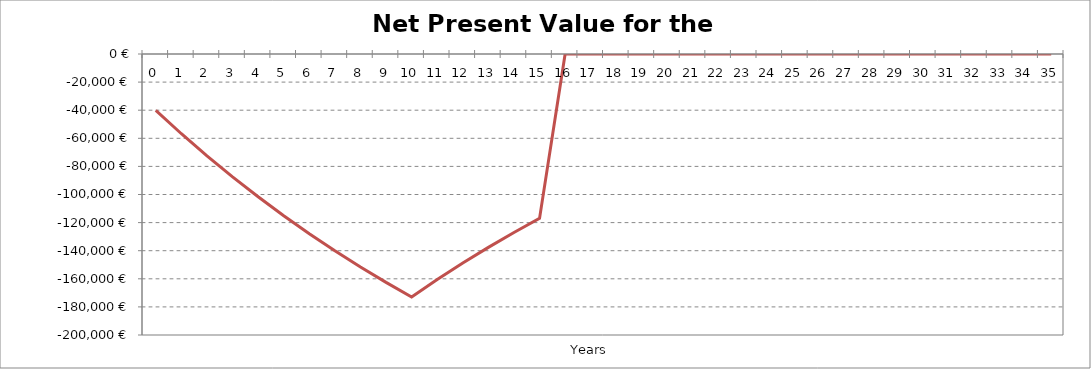
| Category | NPV |
|---|---|
| 0.0 | -40195.6 |
| 1.0 | -56754.699 |
| 2.0 | -72481.543 |
| 3.0 | -87417.959 |
| 4.0 | -101604.554 |
| 5.0 | -115077.298 |
| 6.0 | -127872.904 |
| 7.0 | -140025.406 |
| 8.0 | -151567.9 |
| 9.0 | -162529.535 |
| 10.0 | -172940.239 |
| 11.0 | -160543.525 |
| 12.0 | -148785.076 |
| 13.0 | -137630.954 |
| 14.0 | -127050.925 |
| 15.0 | -117015.649 |
| 16.0 | 0 |
| 17.0 | 0 |
| 18.0 | 0 |
| 19.0 | 0 |
| 20.0 | 0 |
| 21.0 | 0 |
| 22.0 | 0 |
| 23.0 | 0 |
| 24.0 | 0 |
| 25.0 | 0 |
| 26.0 | 0 |
| 27.0 | 0 |
| 28.0 | 0 |
| 29.0 | 0 |
| 30.0 | 0 |
| 31.0 | 0 |
| 32.0 | 0 |
| 33.0 | 0 |
| 34.0 | 0 |
| 35.0 | 0 |